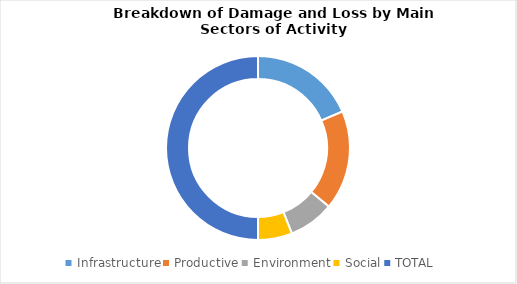
| Category | Series 0 |
|---|---|
| Infrastructure | 0.37 |
| Productive | 0.35 |
| Environment | 0.16 |
| Social | 0.12 |
| TOTAL | 1 |